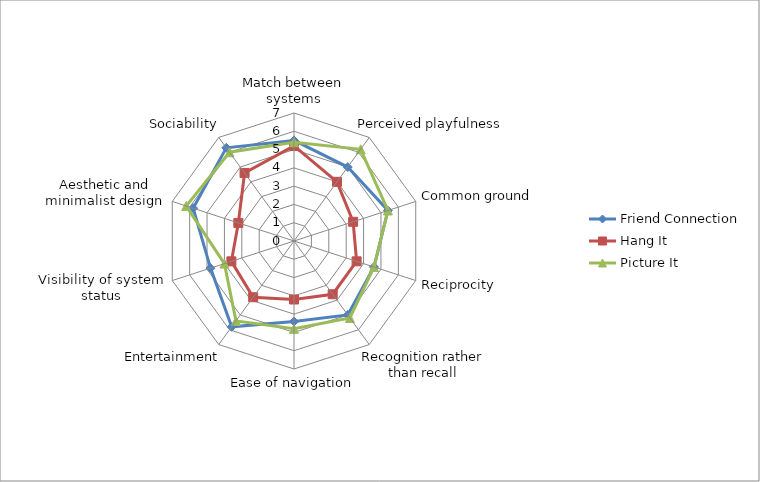
| Category | Friend Connection | Hang It | Picture It |
|---|---|---|---|
| Match between systems | 5.5 | 5.2 | 5.4 |
| Perceived playfulness | 5 | 4 | 6.2 |
| Common ground | 5.4 | 3.4 | 5.4 |
| Reciprocity | 4.6 | 3.6 | 4.6 |
| Recognition rather than recall | 5 | 3.6 | 5.2 |
| Ease of navigation | 4.4 | 3.2 | 4.8 |
| Entertainment | 5.8 | 3.8 | 5.4 |
| Visibility of system status | 4.8 | 3.6 | 4 |
| Aesthetic and minimalist design | 5.8 | 3.2 | 6.2 |
| Sociability | 6.3 | 4.6 | 6 |